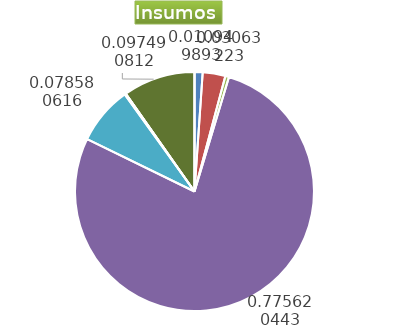
| Category | Series 0 |
|---|---|
| Control arvenses | 687180 |
| Control fitosanitario | 1922380 |
| Cosecha y beneficio | 313302.42 |
| Fertilización | 48675438 |
| Instalación | 4931466.045 |
| Otros | 108800 |
| Podas | 0 |
| Riego | 0 |
| Transporte | 6118209 |
| Tutorado | 0 |